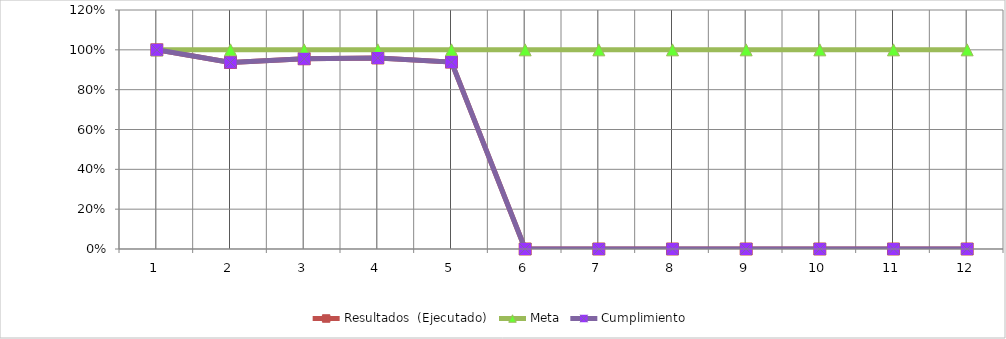
| Category | Resultados  (Ejecutado) | Meta | Cumplimiento |
|---|---|---|---|
| 0 | 1 | 1 | 1 |
| 1 | 0.937 | 1 | 0.937 |
| 2 | 0.955 | 1 | 0.955 |
| 3 | 0.959 | 1 | 0.959 |
| 4 | 0.938 | 1 | 0.938 |
| 5 | 0 | 1 | 0 |
| 6 | 0 | 1 | 0 |
| 7 | 0 | 1 | 0 |
| 8 | 0 | 1 | 0 |
| 9 | 0 | 1 | 0 |
| 10 | 0 | 1 | 0 |
| 11 | 0 | 1 | 0 |